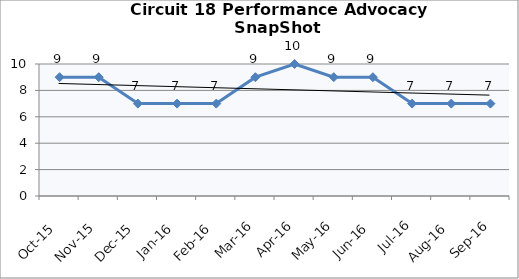
| Category | Circuit 18 |
|---|---|
| Oct-15 | 9 |
| Nov-15 | 9 |
| Dec-15 | 7 |
| Jan-16 | 7 |
| Feb-16 | 7 |
| Mar-16 | 9 |
| Apr-16 | 10 |
| May-16 | 9 |
| Jun-16 | 9 |
| Jul-16 | 7 |
| Aug-16 | 7 |
| Sep-16 | 7 |